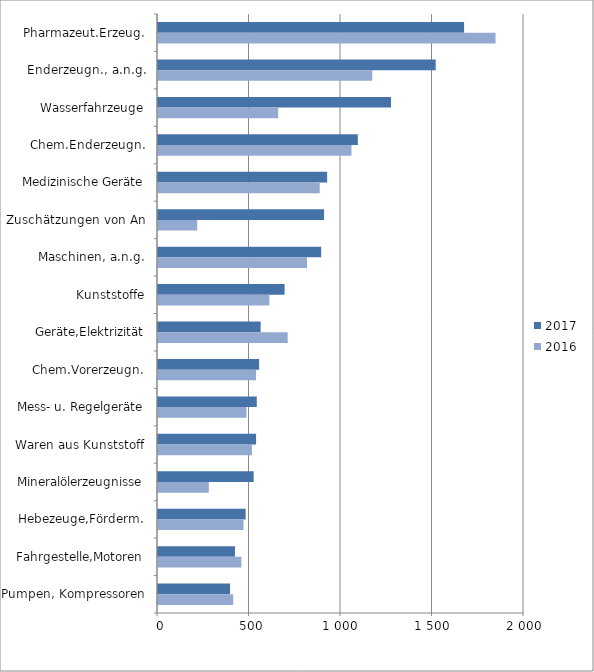
| Category | 2017 | 2016 |
|---|---|---|
| Pharmazeut.Erzeug. | 1672.6 | 1844.364 |
| Enderzeugn., a.n.g. | 1517.591 | 1170.916 |
| Wasserfahrzeuge | 1273.26 | 656.809 |
| Chem.Enderzeugn. | 1091.982 | 1057.314 |
| Medizinische Geräte | 924.204 | 883.736 |
| Zuschätzungen von An | 907.424 | 214.321 |
| Maschinen, a.n.g. | 891.814 | 814.361 |
| Kunststoffe | 691.706 | 608.421 |
| Geräte,Elektrizität | 560.889 | 708.61 |
| Chem.Vorerzeugn. | 552.527 | 535.849 |
| Mess- u. Regelgeräte | 539.711 | 483.506 |
| Waren aus Kunststoff | 535.931 | 513.291 |
| Mineralölerzeugnisse | 522.603 | 277.628 |
| Hebezeuge,Förderm. | 478.946 | 467.09 |
| Fahrgestelle,Motoren | 420.653 | 455.666 |
| Pumpen, Kompressoren | 393.802 | 411 |